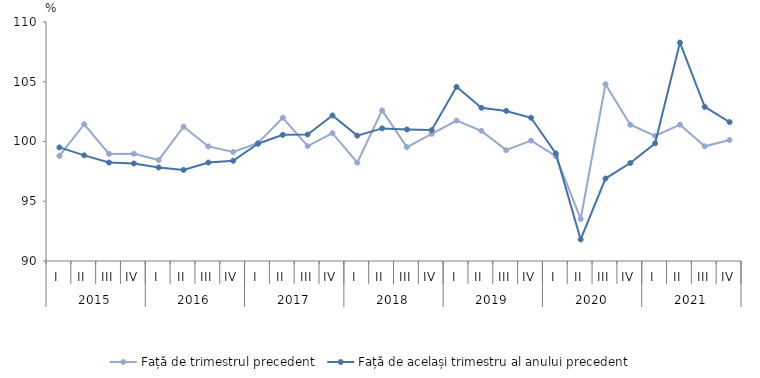
| Category | Față de trimestrul precedent | Față de același trimestru al anului precedent |
|---|---|---|
| 0 | 98.792 | 99.507 |
| 1 | 101.444 | 98.841 |
| 2 | 98.962 | 98.236 |
| 3 | 98.976 | 98.163 |
| 4 | 98.452 | 97.825 |
| 5 | 101.233 | 97.621 |
| 6 | 99.588 | 98.239 |
| 7 | 99.123 | 98.385 |
| 8 | 99.879 | 99.811 |
| 9 | 101.989 | 100.556 |
| 10 | 99.618 | 100.586 |
| 11 | 100.693 | 102.179 |
| 12 | 98.228 | 100.491 |
| 13 | 102.604 | 101.097 |
| 14 | 99.53 | 101.008 |
| 15 | 100.639 | 100.954 |
| 16 | 101.751 | 104.574 |
| 17 | 100.886 | 102.823 |
| 18 | 99.275 | 102.56 |
| 19 | 100.076 | 101.986 |
| 20 | 98.772 | 99 |
| 21 | 93.516 | 91.8 |
| 22 | 104.788 | 96.9 |
| 23 | 101.4 | 98.2 |
| 24 | 100.472 | 99.847 |
| 25 | 101.409 | 108.274 |
| 26 | 99.6 | 102.9 |
| 27 | 100.13 | 101.623 |